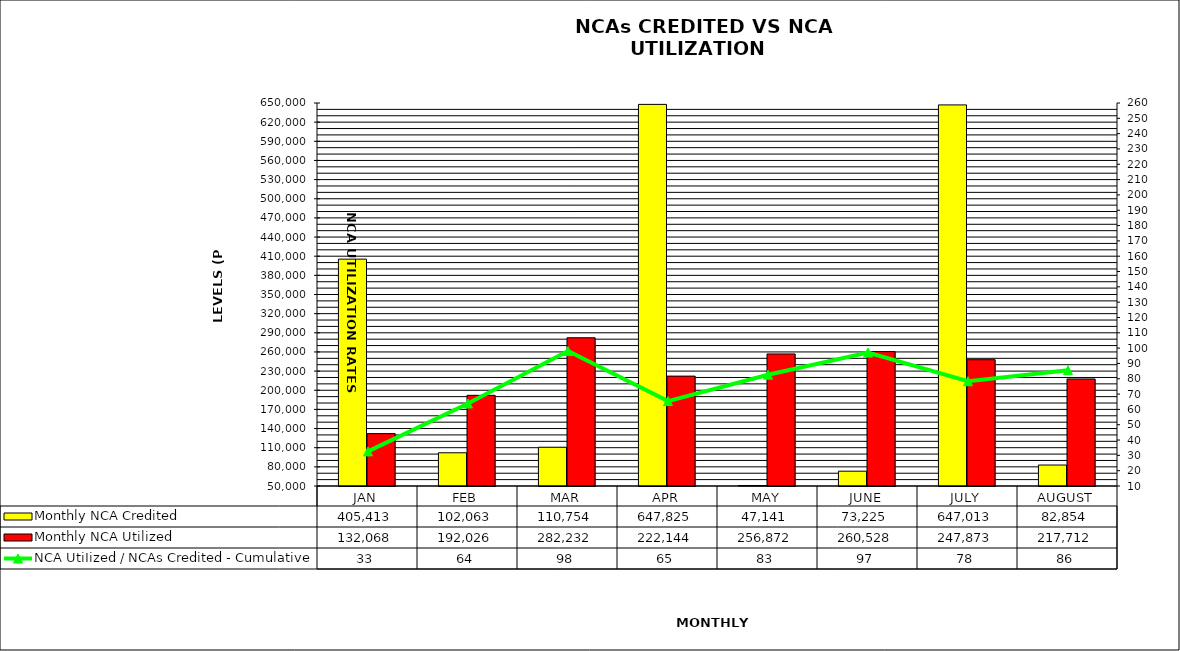
| Category | Monthly NCA Credited | Monthly NCA Utilized |
|---|---|---|
| JAN | 405412.649 | 132068.245 |
| FEB | 102062.543 | 192025.548 |
| MAR | 110753.783 | 282231.938 |
| APR | 647825.13 | 222143.948 |
| MAY | 47140.568 | 256871.588 |
| JUNE | 73225.116 | 260527.957 |
| JULY | 647013.219 | 247872.989 |
| AUGUST | 82854.064 | 217712.435 |